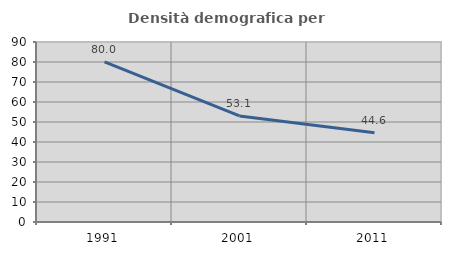
| Category | Densità demografica |
|---|---|
| 1991.0 | 80.015 |
| 2001.0 | 53.054 |
| 2011.0 | 44.58 |